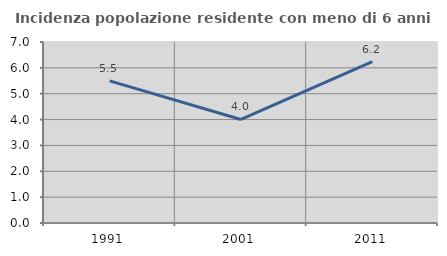
| Category | Incidenza popolazione residente con meno di 6 anni |
|---|---|
| 1991.0 | 5.497 |
| 2001.0 | 4.004 |
| 2011.0 | 6.237 |